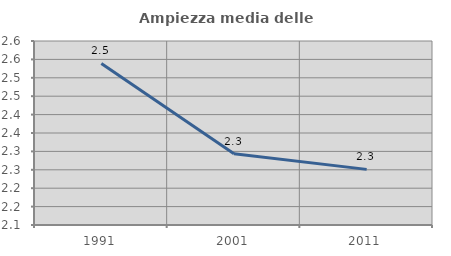
| Category | Ampiezza media delle famiglie |
|---|---|
| 1991.0 | 2.539 |
| 2001.0 | 2.293 |
| 2011.0 | 2.251 |